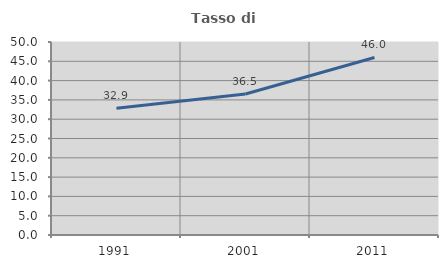
| Category | Tasso di occupazione   |
|---|---|
| 1991.0 | 32.858 |
| 2001.0 | 36.52 |
| 2011.0 | 45.999 |